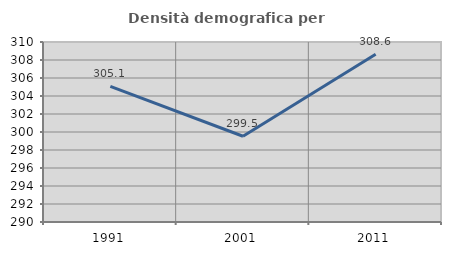
| Category | Densità demografica |
|---|---|
| 1991.0 | 305.071 |
| 2001.0 | 299.528 |
| 2011.0 | 308.639 |